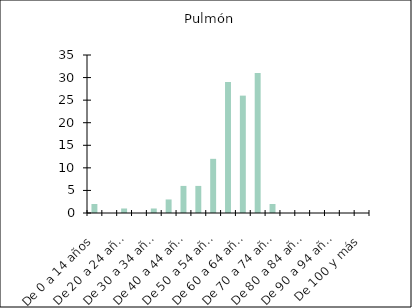
| Category | Pulmón |
|---|---|
| De 0 a 14 años | 2 |
| De 15 a 19 años | 0 |
| De 20 a 24 años | 1 |
| De 25 a 29 años | 0 |
| De 30 a 34 años | 1 |
| De 35 a 39 años | 3 |
| De 40 a 44 años | 6 |
| De 45 a 49 años | 6 |
| De 50 a 54 años | 12 |
| De 55 a 59 años | 29 |
| De 60 a 64 años | 26 |
| De 65 a 69 años | 31 |
| De 70 a 74 años | 2 |
| De 75 a 79 años | 0 |
| De 80 a 84 años | 0 |
| De 85 a 89 años | 0 |
| De 90 a 94 años | 0 |
| De 95 a 99 años | 0 |
| De 100 y más | 0 |